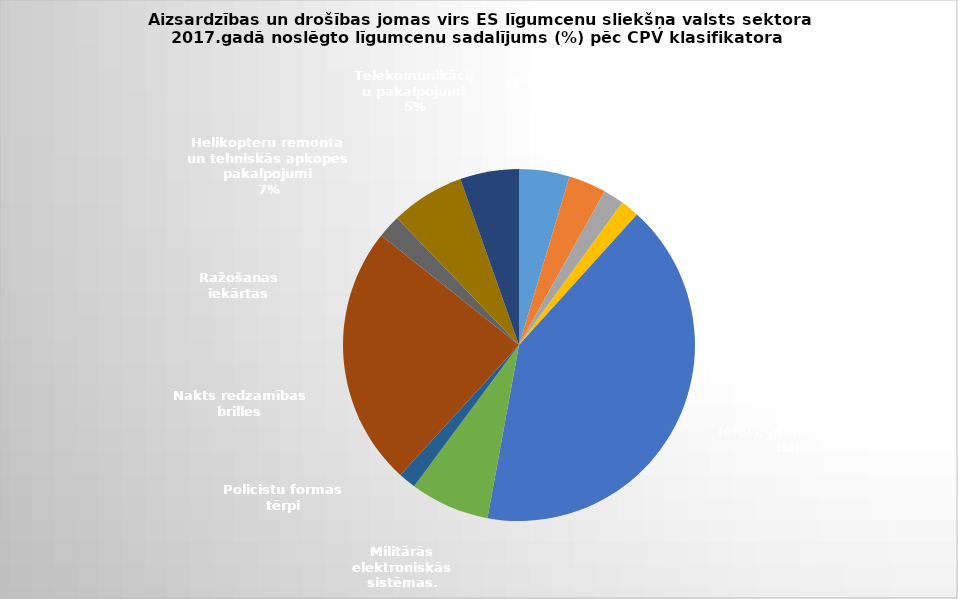
| Category | Series 0 |
|---|---|
| 0 | 0.046 |
| 1 | 0.035 |
| 2 | 0.019 |
| 3 | 0.017 |
| 4 | 0.412 |
| 5 | 0.073 |
| 6 | 0.016 |
| 7 | 0.239 |
| 8 | 0.021 |
| 9 | 0.068 |
| 10 | 0.054 |